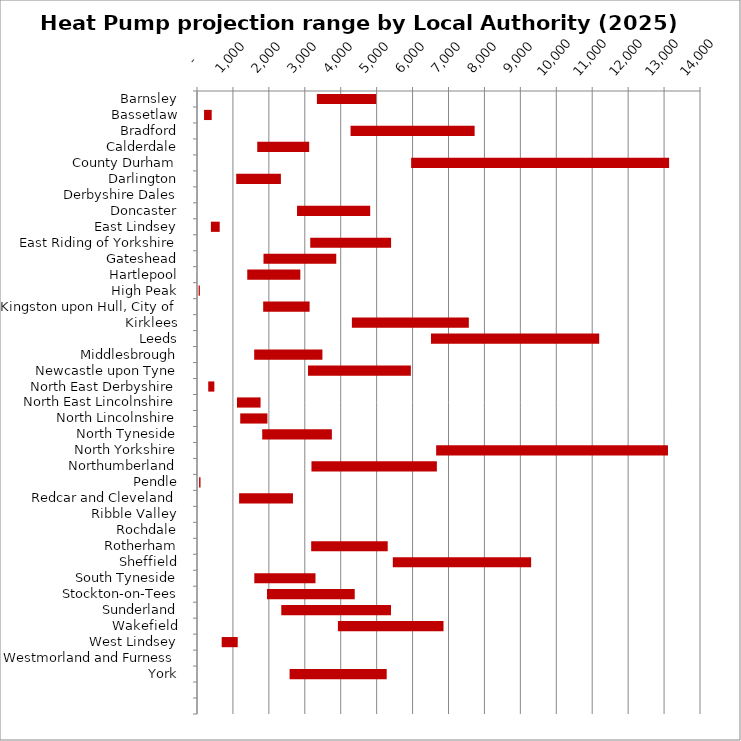
| Category | MIN | MAX |
|---|---|---|
| Barnsley | 3337 | 1649 |
| Bassetlaw | 196 | 213 |
| Bradford | 4274 | 3453 |
| Calderdale | 1677 | 1446 |
| County Durham | 5960 | 7180 |
| Darlington | 1092 | 1243 |
| Derbyshire Dales | 3 | 2 |
| Doncaster | 2784 | 2037 |
| East Lindsey | 387 | 245 |
| East Riding of Yorkshire | 3152 | 2250 |
| Gateshead | 1851 | 2025 |
| Hartlepool | 1399 | 1477 |
| High Peak | 45 | 35 |
| Kingston upon Hull, City of | 1842 | 1292 |
| Kirklees | 4311 | 3255 |
| Leeds | 6513 | 4682 |
| Middlesbrough | 1592 | 1899 |
| Newcastle upon Tyne | 3090 | 2862 |
| North East Derbyshire | 313 | 170 |
| North East Lincolnshire | 1114 | 655 |
| North Lincolnshire | 1203 | 757 |
| North Tyneside | 1815 | 1939 |
| North Yorkshire | 6656 | 6453 |
| Northumberland | 3186 | 3490 |
| Pendle | 58 | 40 |
| Redcar and Cleveland | 1172 | 1499 |
| Ribble Valley | 1 | 0 |
| Rochdale | 0 | 0 |
| Rotherham | 3178 | 2130 |
| Sheffield | 5450 | 3850 |
| South Tyneside | 1595 | 1703 |
| Stockton-on-Tees | 1948 | 2442 |
| Sunderland | 2346 | 3053 |
| Wakefield | 3922 | 2939 |
| West Lindsey | 687 | 446 |
| Westmorland and Furness | 0 | 0 |
| York | 2577 | 2703 |